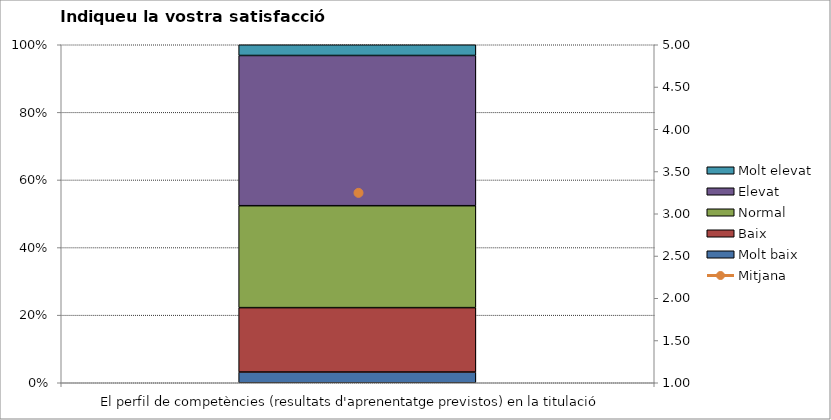
| Category | Molt baix | Baix | Normal  | Elevat | Molt elevat |
|---|---|---|---|---|---|
| El perfil de competències (resultats d'aprenentatge previstos) en la titulació | 2 | 12 | 19 | 28 | 2 |